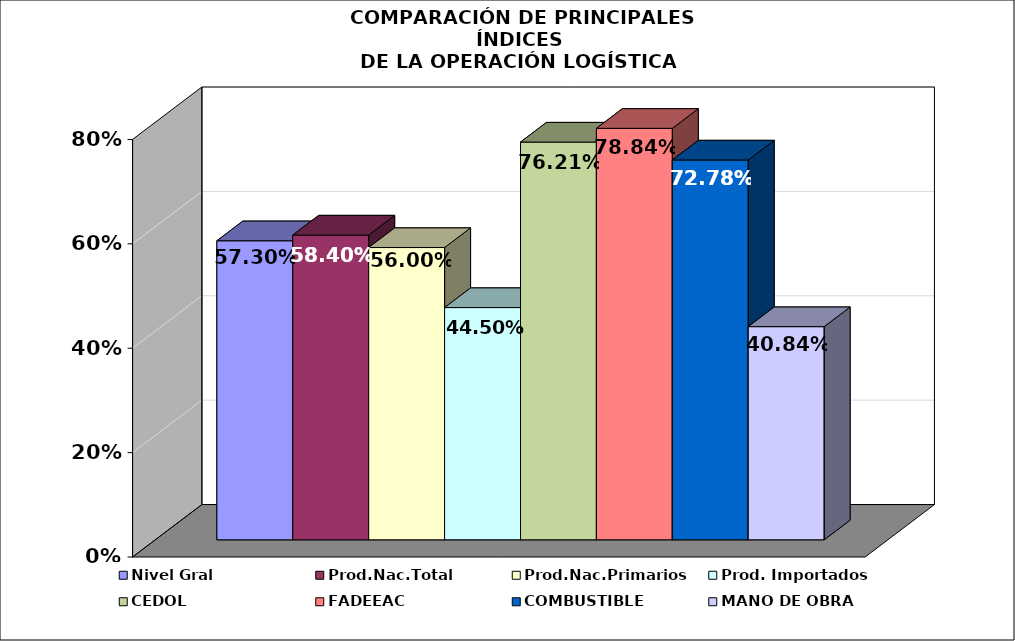
| Category | Nivel Gral | Prod.Nac.Total | Prod.Nac.Primarios | Prod. Importados | CEDOL | FADEEAC | COMBUSTIBLE | MANO DE OBRA |
|---|---|---|---|---|---|---|---|---|
| 0 | 0.573 | 0.584 | 0.56 | 0.445 | 0.762 | 0.788 | 0.728 | 0.408 |